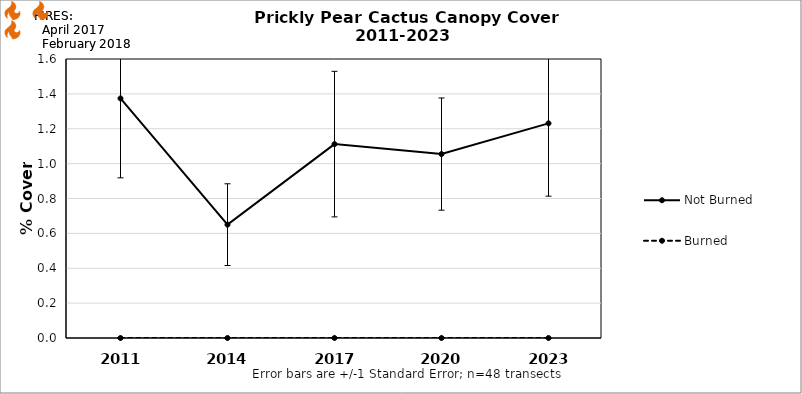
| Category | Not Burned | Burned |
|---|---|---|
| 2011.0 | 1.374 | 0 |
| 2014.0 | 0.65 | 0 |
| 2017.0 | 1.112 | 0 |
| 2020.0 | 1.055 | 0 |
| 2023.0 | 1.231 | 0 |